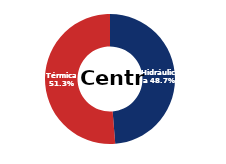
| Category | Centro |
|---|---|
| Eólica | 0 |
| Hidráulica | 1753.182 |
| Solar | 0.007 |
| Térmica | 1845.685 |